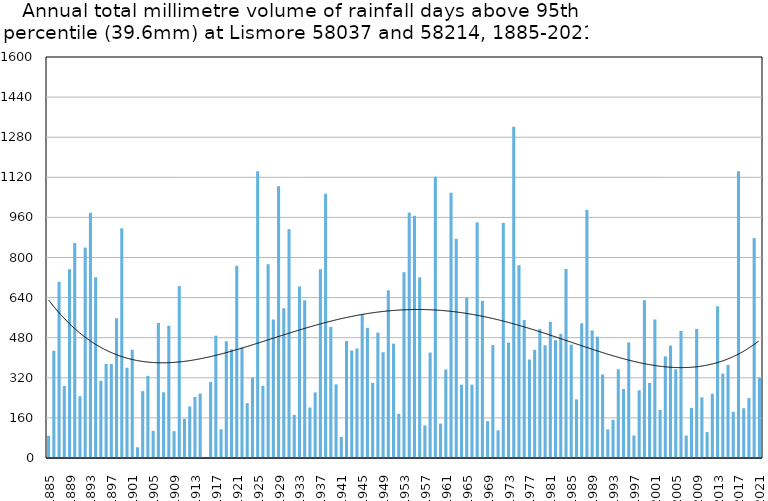
| Category | Annual total mm in days above 95th percentile |
|---|---|
| 1885 | 88.6 |
| 1886 | 427.8 |
| 1887 | 702.8 |
| 1888 | 287.5 |
| 1889 | 753.1 |
| 1890 | 857.7 |
| 1891 | 246.7 |
| 1892 | 839.6 |
| 1893 | 978.6 |
| 1894 | 721.4 |
| 1895 | 308.4 |
| 1896 | 375.2 |
| 1897 | 375.4 |
| 1898 | 557.8 |
| 1899 | 916.3 |
| 1900 | 360.1 |
| 1901 | 431.8 |
| 1902 | 42.7 |
| 1903 | 266.7 |
| 1904 | 327.6 |
| 1905 | 108.4 |
| 1906 | 538.8 |
| 1907 | 262.2 |
| 1908 | 527.7 |
| 1909 | 107.1 |
| 1910 | 686 |
| 1911 | 156.2 |
| 1912 | 205.8 |
| 1913 | 243.8 |
| 1914 | 257.2 |
| 1915 | 0 |
| 1916 | 303.1 |
| 1917 | 488 |
| 1918 | 114.8 |
| 1919 | 465.8 |
| 1920 | 433.6 |
| 1921 | 766.8 |
| 1922 | 440.3 |
| 1923 | 218.7 |
| 1924 | 320.3 |
| 1925 | 1143.9 |
| 1926 | 288.1 |
| 1927 | 773.3 |
| 1928 | 552.7 |
| 1929 | 1084.5 |
| 1930 | 597.4 |
| 1931 | 913.2 |
| 1932 | 172.2 |
| 1933 | 684.4 |
| 1934 | 629 |
| 1935 | 201.2 |
| 1936 | 261.9 |
| 1937 | 753.1 |
| 1938 | 1054.4 |
| 1939 | 523.3 |
| 1940 | 293.9 |
| 1941 | 84.3 |
| 1942 | 466.7 |
| 1943 | 428.6 |
| 1944 | 436.9 |
| 1945 | 573.9 |
| 1946 | 519.5 |
| 1947 | 299.8 |
| 1948 | 500.4 |
| 1949 | 422.3 |
| 1950 | 669.2 |
| 1951 | 456.2 |
| 1952 | 176 |
| 1953 | 741.4 |
| 1954 | 978.8 |
| 1955 | 966.4 |
| 1956 | 720.8 |
| 1957 | 130.1 |
| 1958 | 420.8 |
| 1959 | 1121.8 |
| 1960 | 137.2 |
| 1961 | 353.2 |
| 1962 | 1058.6 |
| 1963 | 874.5 |
| 1964 | 292.4 |
| 1965 | 639.6 |
| 1966 | 292.6 |
| 1967 | 940.2 |
| 1968 | 627.1 |
| 1969 | 146.8 |
| 1970 | 450.6 |
| 1971 | 110.5 |
| 1972 | 938.2 |
| 1973 | 460.6 |
| 1974 | 1321.8 |
| 1975 | 769.1 |
| 1976 | 550.9 |
| 1977 | 393 |
| 1978 | 431.7 |
| 1979 | 514.6 |
| 1980 | 450 |
| 1981 | 543.4 |
| 1982 | 470 |
| 1983 | 495.3 |
| 1984 | 754.4 |
| 1985 | 452.4 |
| 1986 | 233.8 |
| 1987 | 537.7 |
| 1988 | 989.5 |
| 1989 | 509.2 |
| 1990 | 484.2 |
| 1991 | 333.2 |
| 1992 | 114.2 |
| 1993 | 152.4 |
| 1994 | 354 |
| 1995 | 275.4 |
| 1996 | 461 |
| 1997 | 90 |
| 1998 | 270.2 |
| 1999 | 629.6 |
| 2000 | 299.6 |
| 2001 | 552.6 |
| 2002 | 191.7 |
| 2003 | 405.6 |
| 2004 | 448.2 |
| 2005 | 353.8 |
| 2006 | 507 |
| 2007 | 89.6 |
| 2008 | 199.8 |
| 2009 | 514.8 |
| 2010 | 241.8 |
| 2011 | 103.4 |
| 2012 | 256.6 |
| 2013 | 605.4 |
| 2014 | 336.6 |
| 2015 | 371.4 |
| 2016 | 184.4 |
| 2017 | 1144.2 |
| 2018 | 198.8 |
| 2019 | 239.2 |
| 2020 | 877.2 |
| 2021 | 320.8 |